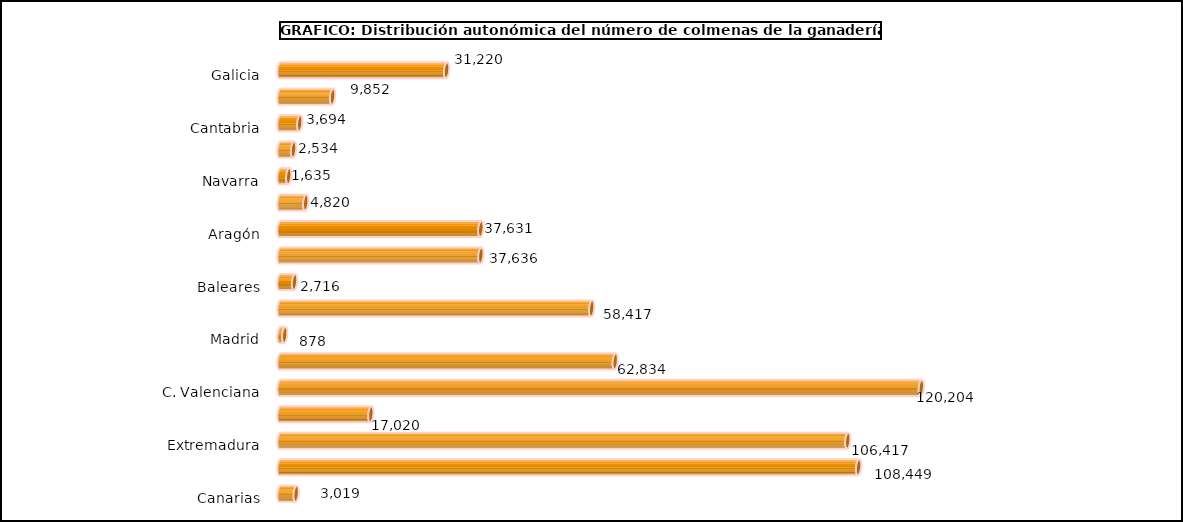
| Category | num. Animales |
|---|---|
|   Galicia | 31220 |
|   P. de Asturias | 9852 |
|   Cantabria | 3694 |
|   País Vasco | 2534 |
|   Navarra | 1635 |
|   La Rioja | 4820 |
|   Aragón | 37631 |
|   Cataluña | 37636 |
|   Baleares | 2716 |
|   Castilla y León | 58417 |
|   Madrid | 878 |
|   Castilla – La Mancha | 62834 |
|   C. Valenciana | 120204 |
|   R. de Murcia | 17020 |
|   Extremadura | 106417 |
|   Andalucía | 108449 |
|   Canarias | 3019 |